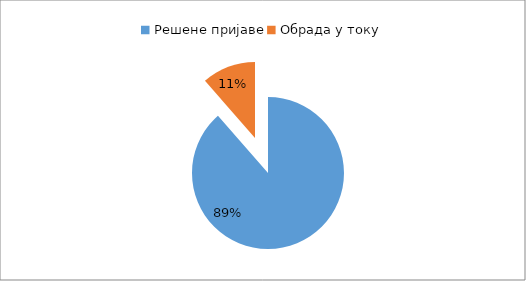
| Category | Series 0 |
|---|---|
| Решене пријаве | 0.896 |
| Обрада у току | 0.116 |